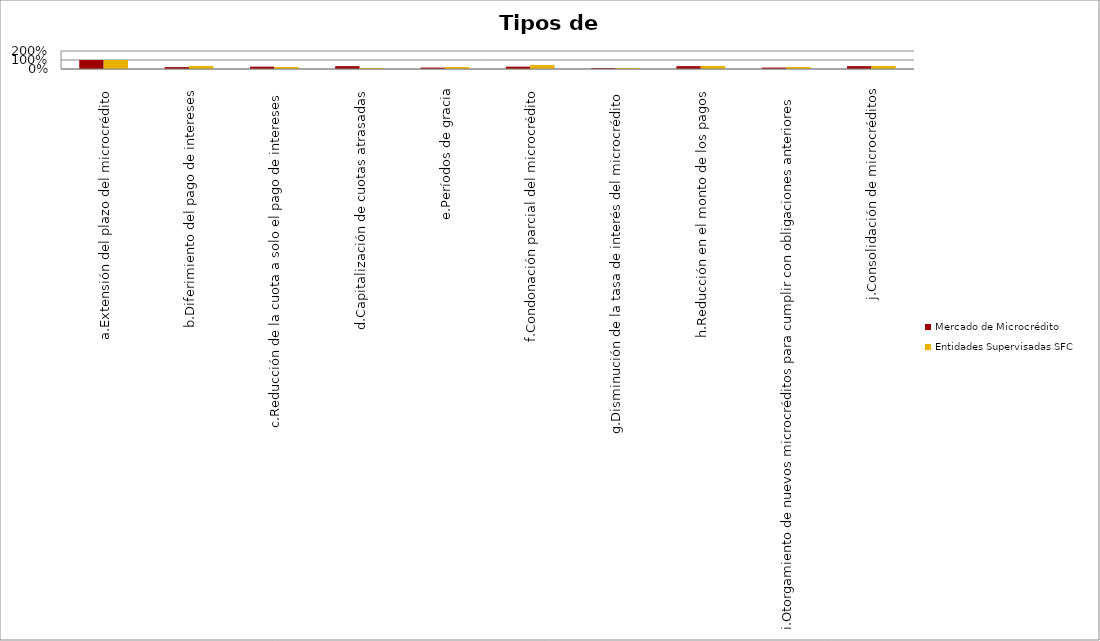
| Category | Mercado de Microcrédito | Entidades Supervisadas SFC |
|---|---|---|
| a.Extensión del plazo del microcrédito | 1 | 1 |
| b.Diferimiento del pago de intereses | 0.211 | 0.333 |
| c.Reducción de la cuota a solo el pago de intereses | 0.263 | 0.222 |
| d.Capitalización de cuotas atrasadas | 0.316 | 0.111 |
| e.Períodos de gracia | 0.158 | 0.222 |
| f.Condonación parcial del microcrédito | 0.263 | 0.444 |
| g.Disminución de la tasa de interés del microcrédito | 0.105 | 0.111 |
| h.Reducción en el monto de los pagos | 0.316 | 0.333 |
| i.Otorgamiento de nuevos microcréditos para cumplir con obligaciones anteriores | 0.158 | 0.222 |
| j.Consolidación de microcréditos | 0.316 | 0.333 |